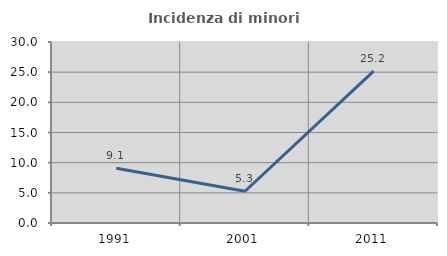
| Category | Incidenza di minori stranieri |
|---|---|
| 1991.0 | 9.091 |
| 2001.0 | 5.263 |
| 2011.0 | 25.18 |